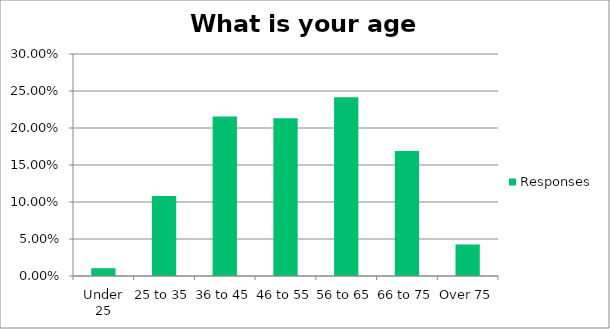
| Category | Responses |
|---|---|
| Under 25 | 0.01 |
| 25 to 35 | 0.108 |
| 36 to 45 | 0.215 |
| 46 to 55 | 0.213 |
| 56 to 65 | 0.241 |
| 66 to 75 | 0.169 |
| Over 75 | 0.043 |